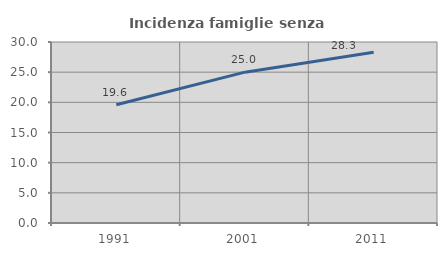
| Category | Incidenza famiglie senza nuclei |
|---|---|
| 1991.0 | 19.6 |
| 2001.0 | 25 |
| 2011.0 | 28.309 |